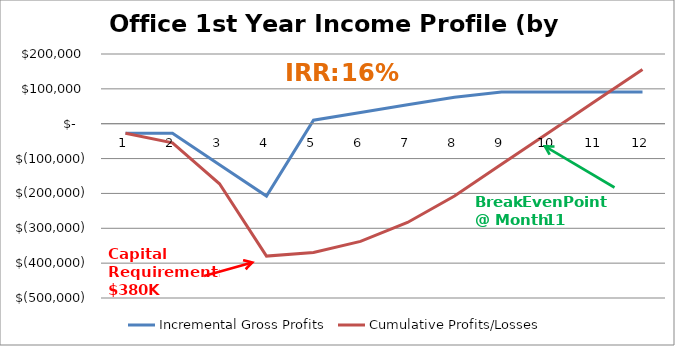
| Category | Incremental Gross Profits | Cumulative Profits/Losses |
|---|---|---|
| 0 | -27439.467 | -27439.467 |
| 1 | -27439.467 | -54878.933 |
| 2 | -117439.467 | -172318.4 |
| 3 | -207439.467 | -379757.867 |
| 4 | 10130.133 | -369627.733 |
| 5 | 32126.133 | -337501.6 |
| 6 | 54122.133 | -283379.467 |
| 7 | 76118.133 | -207261.333 |
| 8 | 90782.133 | -116479.2 |
| 9 | 90782.133 | -25697.067 |
| 10 | 90782.133 | 65085.067 |
| 11 | 90782.133 | 155867.2 |